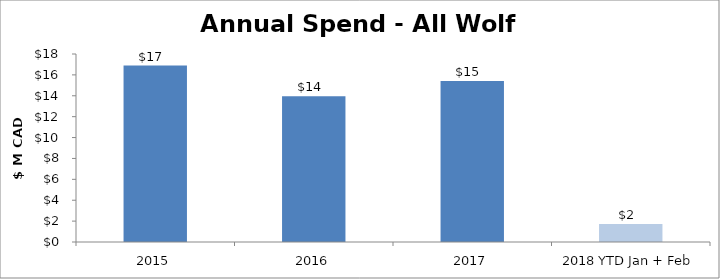
| Category | Total |
|---|---|
| 2015 | 16891071 |
| 2016 | 13945417 |
| 2017 | 15412442.75 |
| 2018 YTD Jan + Feb | 1718059.14 |